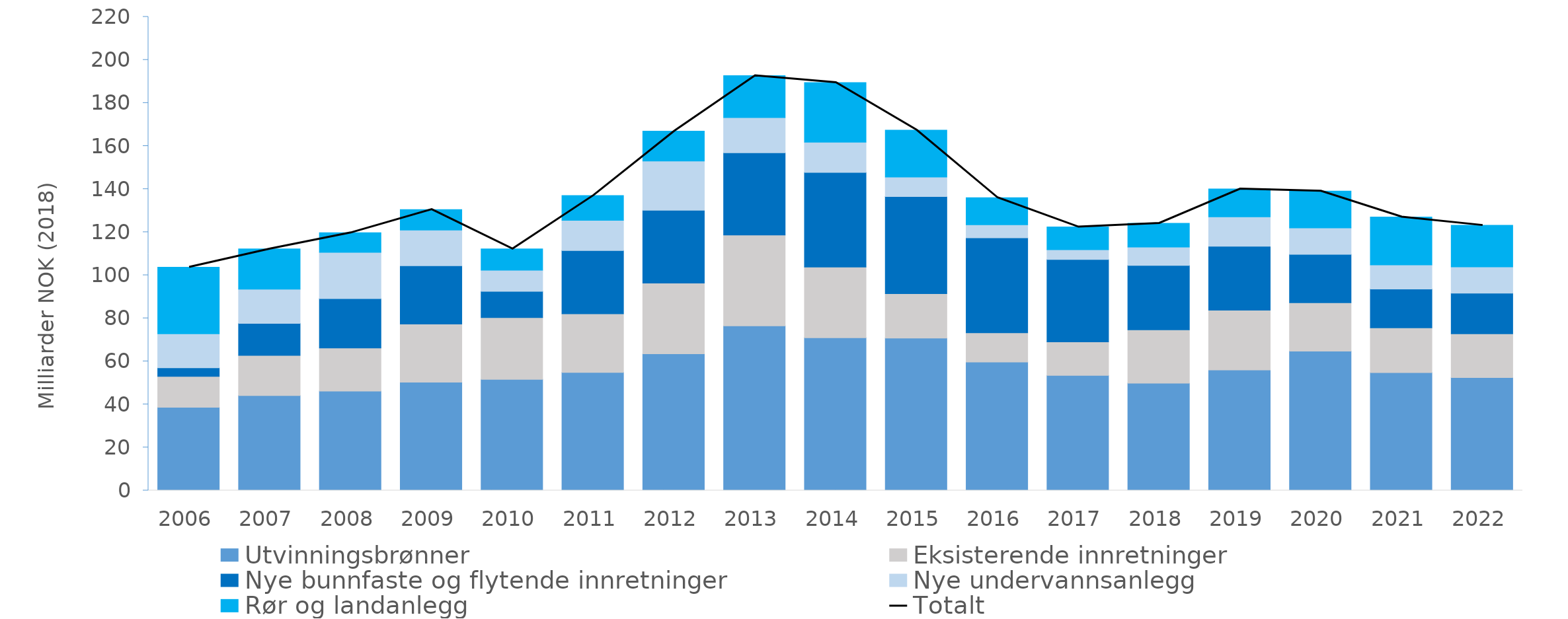
| Category | Utvinningsbrønner | Eksisterende innretninger | Nye bunnfaste og flytende innretninger | Nye undervannsanlegg | Rør og landanlegg |
|---|---|---|---|---|---|
| 2006.0 | 38.638 | 14.354 | 3.991 | 15.783 | 30.919 |
| 2007.0 | 44.126 | 18.625 | 14.85 | 15.915 | 18.709 |
| 2008.0 | 46.211 | 19.99 | 22.925 | 21.51 | 9.082 |
| 2009.0 | 50.353 | 26.964 | 27.078 | 16.559 | 9.551 |
| 2010.0 | 51.606 | 28.743 | 12.162 | 9.821 | 9.867 |
| 2011.0 | 54.883 | 27.188 | 29.373 | 14.018 | 11.567 |
| 2012.0 | 63.541 | 32.787 | 33.855 | 22.832 | 13.884 |
| 2013.0 | 76.45 | 42.236 | 38.212 | 16.329 | 19.437 |
| 2014.0 | 70.951 | 32.797 | 43.98 | 14.027 | 27.72 |
| 2015.0 | 70.778 | 20.622 | 45.171 | 8.994 | 21.81 |
| 2016.0 | 59.694 | 13.55 | 44.139 | 6.068 | 12.545 |
| 2017.0 | 53.472 | 15.588 | 38.234 | 4.509 | 10.593 |
| 2018.0 | 49.87 | 24.801 | 29.876 | 8.513 | 11.083 |
| 2019.0 | 55.992 | 27.802 | 29.669 | 13.617 | 12.99 |
| 2020.0 | 64.739 | 22.495 | 22.422 | 12.336 | 17.084 |
| 2021.0 | 54.759 | 20.814 | 17.998 | 11.193 | 22.292 |
| 2022.0 | 52.453 | 20.377 | 18.803 | 12.202 | 19.321 |